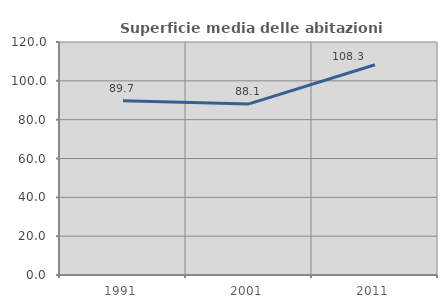
| Category | Superficie media delle abitazioni occupate |
|---|---|
| 1991.0 | 89.712 |
| 2001.0 | 88.108 |
| 2011.0 | 108.254 |